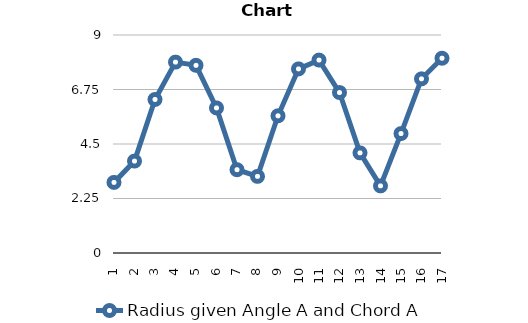
| Category | Radius given Angle A and Chord A |
|---|---|
| 1 | 2.914 |
| 2 | 3.795 |
| 3 | 6.338 |
| 4 | 7.88 |
| 5 | 7.748 |
| 6 | 5.989 |
| 7 | 3.439 |
| 8 | 3.163 |
| 9 | 5.664 |
| 10 | 7.6 |
| 11 | 7.965 |
| 12 | 6.624 |
| 13 | 4.133 |
| 14 | 2.771 |
| 15 | 4.93 |
| 16 | 7.19 |
| 17 | 8.04 |